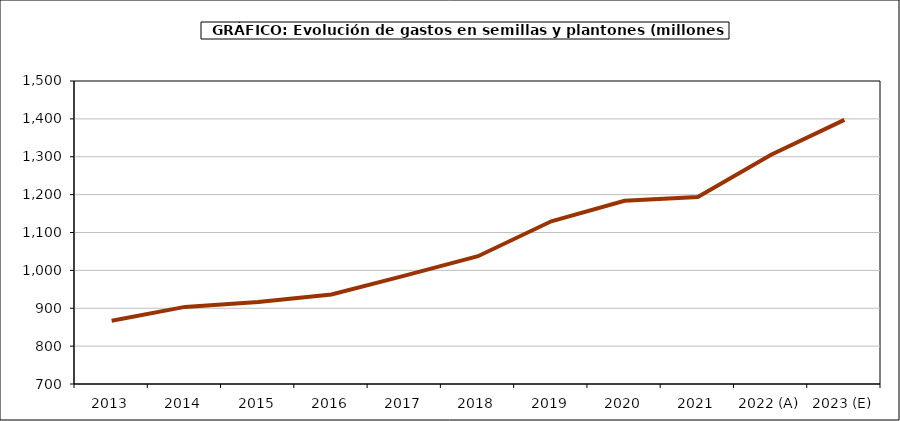
| Category | Semillas |
|---|---|
| 2013 | 867.097 |
| 2014 | 903.589 |
| 2015 | 916.393 |
| 2016 | 936.239 |
| 2017 | 986.016 |
| 2018 | 1037.335 |
| 2019 | 1129.568 |
| 2020 | 1183.727 |
| 2021 | 1193.467 |
| 2022 (A) | 1305.344 |
| 2023 (E) | 1397.432 |